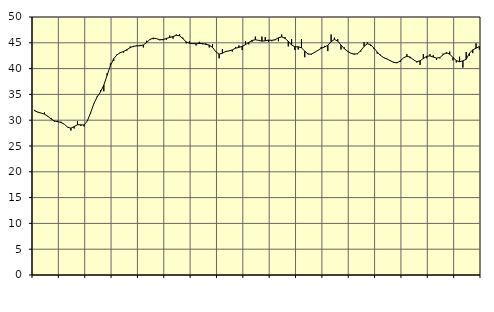
| Category | Piggar | Series 1 |
|---|---|---|
| nan | 32 | 31.82 |
| 87.0 | 31.5 | 31.57 |
| 87.0 | 31.4 | 31.37 |
| 87.0 | 31.5 | 31.16 |
| nan | 30.7 | 30.76 |
| 88.0 | 30.4 | 30.22 |
| 88.0 | 29.7 | 29.86 |
| 88.0 | 29.9 | 29.71 |
| nan | 29.7 | 29.57 |
| 89.0 | 29.2 | 29.22 |
| 89.0 | 28.7 | 28.65 |
| 89.0 | 28 | 28.45 |
| nan | 28.4 | 28.77 |
| 90.0 | 29.8 | 29.13 |
| 90.0 | 28.9 | 29.1 |
| 90.0 | 28.8 | 29.07 |
| nan | 29.9 | 29.86 |
| 91.0 | 31.3 | 31.46 |
| 91.0 | 33.3 | 33.24 |
| 91.0 | 34.7 | 34.55 |
| nan | 35.8 | 35.48 |
| 92.0 | 35.6 | 36.81 |
| 92.0 | 39.1 | 38.69 |
| 92.0 | 41 | 40.58 |
| nan | 41.5 | 41.92 |
| 93.0 | 42.8 | 42.67 |
| 93.0 | 43.2 | 43.08 |
| 93.0 | 43.1 | 43.33 |
| nan | 43.5 | 43.66 |
| 94.0 | 44.3 | 44.05 |
| 94.0 | 44.2 | 44.33 |
| 94.0 | 44.5 | 44.41 |
| nan | 44.6 | 44.42 |
| 95.0 | 44.1 | 44.58 |
| 95.0 | 45.4 | 45.06 |
| 95.0 | 45.6 | 45.65 |
| nan | 45.7 | 45.91 |
| 96.0 | 45.8 | 45.79 |
| 96.0 | 45.5 | 45.59 |
| 96.0 | 45.5 | 45.63 |
| nan | 45.6 | 45.85 |
| 97.0 | 46.4 | 46.02 |
| 97.0 | 45.8 | 46.21 |
| 97.0 | 46.6 | 46.45 |
| nan | 46.7 | 46.37 |
| 98.0 | 46 | 45.8 |
| 98.0 | 44.9 | 45.19 |
| 98.0 | 45.3 | 44.91 |
| nan | 44.9 | 44.84 |
| 99.0 | 44.5 | 44.82 |
| 99.0 | 45.2 | 44.85 |
| 99.0 | 44.7 | 44.85 |
| nan | 44.9 | 44.7 |
| 0.0 | 44.1 | 44.56 |
| 0.0 | 44.7 | 44.11 |
| 0.0 | 43.3 | 43.26 |
| nan | 42 | 42.8 |
| 1.0 | 43.8 | 42.98 |
| 1.0 | 43.2 | 43.34 |
| 1.0 | 43.4 | 43.42 |
| nan | 43.3 | 43.62 |
| 2.0 | 44.2 | 43.95 |
| 2.0 | 44.5 | 44.11 |
| 2.0 | 43.6 | 44.32 |
| nan | 45.3 | 44.65 |
| 3.0 | 44.7 | 45.08 |
| 3.0 | 45.2 | 45.46 |
| 3.0 | 46.2 | 45.59 |
| nan | 45.5 | 45.47 |
| 4.0 | 46.2 | 45.32 |
| 4.0 | 46.1 | 45.39 |
| 4.0 | 45.2 | 45.52 |
| nan | 45.3 | 45.48 |
| 5.0 | 45.5 | 45.59 |
| 5.0 | 45.3 | 45.98 |
| 5.0 | 46.6 | 46.14 |
| nan | 46.1 | 45.87 |
| 6.0 | 44.3 | 45.28 |
| 6.0 | 45.7 | 44.56 |
| 6.0 | 43.6 | 44.23 |
| nan | 43.7 | 44.24 |
| 7.0 | 45.7 | 44.02 |
| 7.0 | 42.2 | 43.39 |
| 7.0 | 42.9 | 42.8 |
| nan | 42.7 | 42.81 |
| 8.0 | 43.1 | 43.16 |
| 8.0 | 43.5 | 43.53 |
| 8.0 | 44.2 | 43.94 |
| nan | 44.4 | 44.18 |
| 9.0 | 43.4 | 44.53 |
| 9.0 | 46.6 | 45.22 |
| 9.0 | 46 | 45.65 |
| nan | 45.7 | 45.33 |
| 10.0 | 43.7 | 44.57 |
| 10.0 | 44.1 | 43.86 |
| 10.0 | 43.3 | 43.36 |
| nan | 43 | 42.98 |
| 11.0 | 42.9 | 42.77 |
| 11.0 | 42.8 | 42.9 |
| 11.0 | 43.3 | 43.47 |
| nan | 45.1 | 44.31 |
| 12.0 | 45.1 | 44.81 |
| 12.0 | 44.4 | 44.62 |
| 12.0 | 43.8 | 43.97 |
| nan | 42.9 | 43.21 |
| 13.0 | 42.7 | 42.53 |
| 13.0 | 42.2 | 42.12 |
| 13.0 | 41.9 | 41.84 |
| nan | 41.6 | 41.52 |
| 14.0 | 41.3 | 41.19 |
| 14.0 | 41.2 | 41.11 |
| 14.0 | 41.3 | 41.5 |
| nan | 42.1 | 42.09 |
| 15.0 | 42.8 | 42.39 |
| 15.0 | 42 | 42.23 |
| 15.0 | 41.8 | 41.71 |
| nan | 41.2 | 41.33 |
| 16.0 | 40.7 | 41.51 |
| 16.0 | 42.8 | 41.96 |
| 16.0 | 42 | 42.38 |
| nan | 42.8 | 42.46 |
| 17.0 | 42.6 | 42.24 |
| 17.0 | 41.7 | 42.03 |
| 17.0 | 42 | 42.13 |
| nan | 42.9 | 42.69 |
| 18.0 | 42.9 | 43.09 |
| 18.0 | 43.3 | 42.8 |
| 18.0 | 41.6 | 42.14 |
| nan | 41.2 | 41.56 |
| 19.0 | 42.3 | 41.33 |
| 19.0 | 40.2 | 41.5 |
| 19.0 | 43.2 | 41.8 |
| nan | 42.5 | 42.98 |
| 20.0 | 43 | 43.64 |
| 20.0 | 44.9 | 43.95 |
| 20.0 | 43.7 | 44.29 |